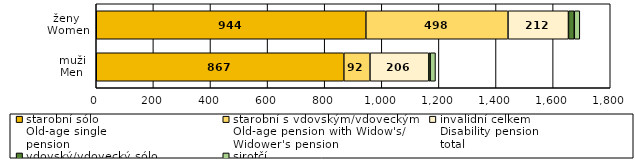
| Category | starobní sólo
Old-age single
pension | starobní s vdovským/vdoveckým
Old-age pension with Widow's/
Widower's pension
 | invalidní celkem
Disability pension
total | vdovský/vdovecký sólo
Widow's/Widower's
single pension | sirotčí
Orphan
pension |
|---|---|---|---|---|---|
| muži
Men | 867.017 | 91.505 | 205.867 | 4.852 | 18.739 |
| ženy 
Women | 944.194 | 497.763 | 211.772 | 20.327 | 19.388 |